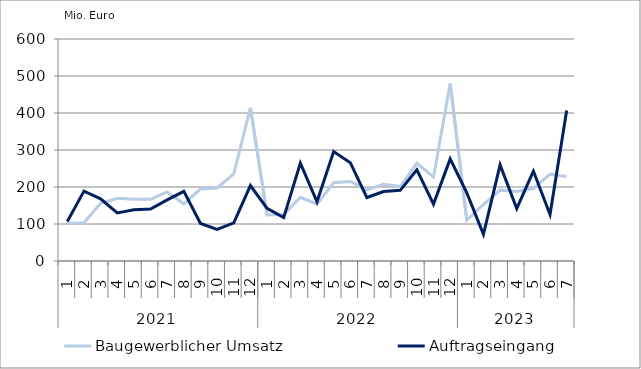
| Category | Baugewerblicher Umsatz | Auftragseingang |
|---|---|---|
| 0 | 101295.895 | 106850.127 |
| 1 | 103236.543 | 188883.434 |
| 2 | 156172.725 | 168204.42 |
| 3 | 169257.088 | 130052.073 |
| 4 | 166897.821 | 138492.214 |
| 5 | 166720.216 | 140262.426 |
| 6 | 186515.191 | 165331.191 |
| 7 | 154188.941 | 188169.655 |
| 8 | 194464.12 | 101359.538 |
| 9 | 197281.201 | 85626.862 |
| 10 | 235325.083 | 102880.924 |
| 11 | 414469.471 | 203900.676 |
| 12 | 124217.549 | 142351.759 |
| 13 | 125619.696 | 117194.423 |
| 14 | 171896.664 | 264509.013 |
| 15 | 153384.654 | 160146.519 |
| 16 | 211335.38 | 295997.826 |
| 17 | 214914.164 | 265813.917 |
| 18 | 192047.613 | 171529.517 |
| 19 | 207577.681 | 187809.656 |
| 20 | 201109.781 | 190941.096 |
| 21 | 264135.048 | 246250.021 |
| 22 | 227299.047 | 153783.993 |
| 23 | 480026.589 | 276019.328 |
| 24 | 110408.991 | 184068.731 |
| 25 | 152702.87 | 72330.186 |
| 26 | 191677.032 | 259741.102 |
| 27 | 187876.702 | 141464.389 |
| 28 | 195815.34 | 243069.898 |
| 29 | 234759.067 | 125882.939 |
| 30 | 228043.08 | 406932.293 |